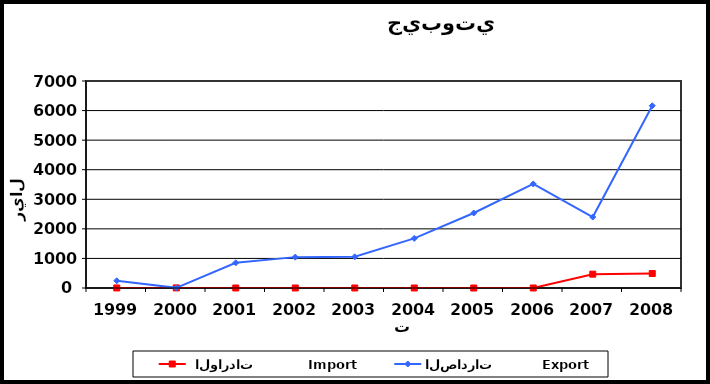
| Category |  الواردات           Import | الصادرات          Export |
|---|---|---|
| 1999.0 | 2 | 245 |
| 2000.0 | 3 | 6 |
| 2001.0 | 1 | 853 |
| 2002.0 | 1 | 1044 |
| 2003.0 | 1 | 1055 |
| 2004.0 | 1 | 1677 |
| 2005.0 | 0 | 2536 |
| 2006.0 | 1 | 3519 |
| 2007.0 | 468 | 2399 |
| 2008.0 | 489 | 6163 |